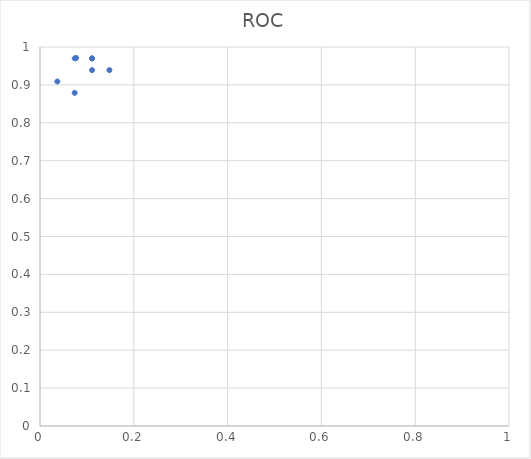
| Category | Series 0 |
|---|---|
| 0.074 | 0.879 |
| 0.074 | 0.97 |
| 0.037 | 0.909 |
| 0.077 | 0.971 |
| 0.111 | 0.97 |
| 0.148 | 0.939 |
| 0.111 | 0.939 |
| 0.111 | 0.97 |